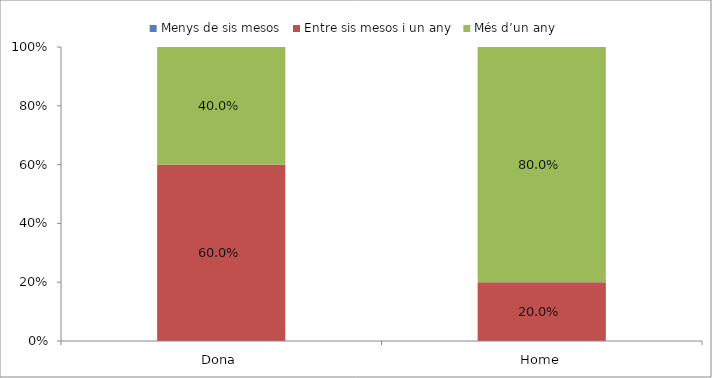
| Category | Menys de sis mesos | Entre sis mesos i un any | Més d’un any |
|---|---|---|---|
| Dona | 0 | 0.6 | 0.4 |
| Home | 0 | 0.2 | 0.8 |